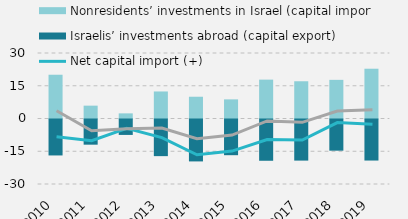
| Category | Nonresidents’ investments in Israel (capital import) | Israelis’ investments abroad (capital export) |
|---|---|---|
| 0 | 20.041 | -16.466 |
| 1 | 5.885 | -11.53 |
| 2 | 2.351 | -7.064 |
| 3 | 12.381 | -16.78 |
| 4 | 9.967 | -19.199 |
| 5 | 8.756 | -16.35 |
| 6 | 17.802 | -18.899 |
| 7 | 17.056 | -18.824 |
| 8 | 17.7 | -14.276 |
| 9 | 22.8 | -18.8 |